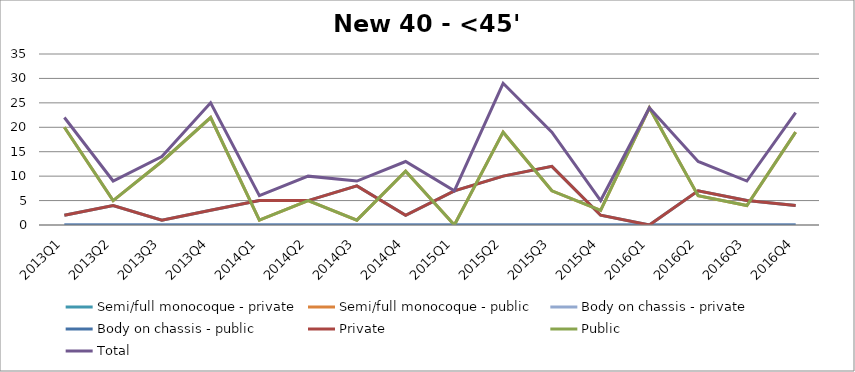
| Category | Semi/full monocoque - private | Semi/full monocoque - public | Body on chassis - private | Body on chassis - public | Private | Public | Total |
|---|---|---|---|---|---|---|---|
| 2013Q1 | 2 | 20 | 0 | 0 | 2 | 20 | 22 |
| 2013Q2 | 4 | 5 | 0 | 0 | 4 | 5 | 9 |
| 2013Q3 | 1 | 13 | 0 | 0 | 1 | 13 | 14 |
| 2013Q4 | 3 | 22 | 0 | 0 | 3 | 22 | 25 |
| 2014Q1 | 5 | 1 | 0 | 0 | 5 | 1 | 6 |
| 2014Q2 | 5 | 5 | 0 | 0 | 5 | 5 | 10 |
| 2014Q3 | 8 | 1 | 0 | 0 | 8 | 1 | 9 |
| 2014Q4 | 2 | 11 | 0 | 0 | 2 | 11 | 13 |
| 2015Q1 | 7 | 0 | 0 | 0 | 7 | 0 | 7 |
| 2015Q2 | 10 | 19 | 0 | 0 | 10 | 19 | 29 |
| 2015Q3 | 12 | 7 | 0 | 0 | 12 | 7 | 19 |
| 2015Q4 | 2 | 3 | 0 | 0 | 2 | 3 | 5 |
| 2016Q1 | 0 | 24 | 0 | 0 | 0 | 24 | 24 |
| 2016Q2 | 7 | 6 | 0 | 0 | 7 | 6 | 13 |
| 2016Q3 | 5 | 4 | 0 | 0 | 5 | 4 | 9 |
| 2016Q4 | 4 | 19 | 0 | 0 | 4 | 19 | 23 |